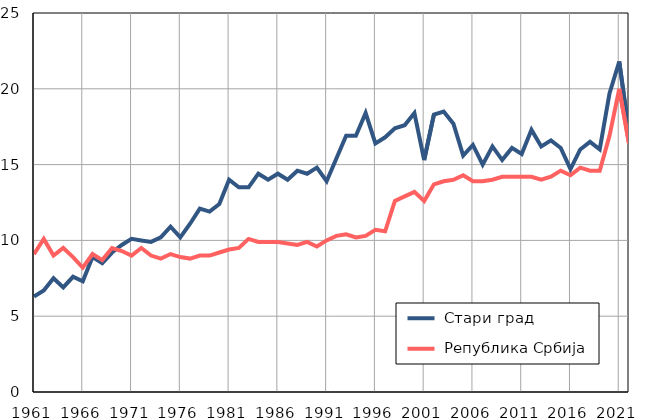
| Category |  Стари град |  Република Србија |
|---|---|---|
| 1961.0 | 6.3 | 9.1 |
| 1962.0 | 6.7 | 10.1 |
| 1963.0 | 7.5 | 9 |
| 1964.0 | 6.9 | 9.5 |
| 1965.0 | 7.6 | 8.9 |
| 1966.0 | 7.3 | 8.2 |
| 1967.0 | 8.9 | 9.1 |
| 1968.0 | 8.5 | 8.7 |
| 1969.0 | 9.2 | 9.5 |
| 1970.0 | 9.7 | 9.3 |
| 1971.0 | 10.1 | 9 |
| 1972.0 | 10 | 9.5 |
| 1973.0 | 9.9 | 9 |
| 1974.0 | 10.2 | 8.8 |
| 1975.0 | 10.9 | 9.1 |
| 1976.0 | 10.2 | 8.9 |
| 1977.0 | 11.1 | 8.8 |
| 1978.0 | 12.1 | 9 |
| 1979.0 | 11.9 | 9 |
| 1980.0 | 12.4 | 9.2 |
| 1981.0 | 14 | 9.4 |
| 1982.0 | 13.5 | 9.5 |
| 1983.0 | 13.5 | 10.1 |
| 1984.0 | 14.4 | 9.9 |
| 1985.0 | 14 | 9.9 |
| 1986.0 | 14.4 | 9.9 |
| 1987.0 | 14 | 9.8 |
| 1988.0 | 14.6 | 9.7 |
| 1989.0 | 14.4 | 9.9 |
| 1990.0 | 14.8 | 9.6 |
| 1991.0 | 13.9 | 10 |
| 1992.0 | 15.4 | 10.3 |
| 1993.0 | 16.9 | 10.4 |
| 1994.0 | 16.9 | 10.2 |
| 1995.0 | 18.4 | 10.3 |
| 1996.0 | 16.4 | 10.7 |
| 1997.0 | 16.8 | 10.6 |
| 1998.0 | 17.4 | 12.6 |
| 1999.0 | 17.6 | 12.9 |
| 2000.0 | 18.4 | 13.2 |
| 2001.0 | 15.3 | 12.6 |
| 2002.0 | 18.3 | 13.7 |
| 2003.0 | 18.5 | 13.9 |
| 2004.0 | 17.7 | 14 |
| 2005.0 | 15.6 | 14.3 |
| 2006.0 | 16.3 | 13.9 |
| 2007.0 | 15 | 13.9 |
| 2008.0 | 16.2 | 14 |
| 2009.0 | 15.3 | 14.2 |
| 2010.0 | 16.1 | 14.2 |
| 2011.0 | 15.7 | 14.2 |
| 2012.0 | 17.3 | 14.2 |
| 2013.0 | 16.2 | 14 |
| 2014.0 | 16.6 | 14.2 |
| 2015.0 | 16.1 | 14.6 |
| 2016.0 | 14.7 | 14.3 |
| 2017.0 | 16 | 14.8 |
| 2018.0 | 16.5 | 14.6 |
| 2019.0 | 16 | 14.6 |
| 2020.0 | 19.7 | 16.9 |
| 2021.0 | 21.8 | 20 |
| 2022.0 | 17.1 | 16.4 |